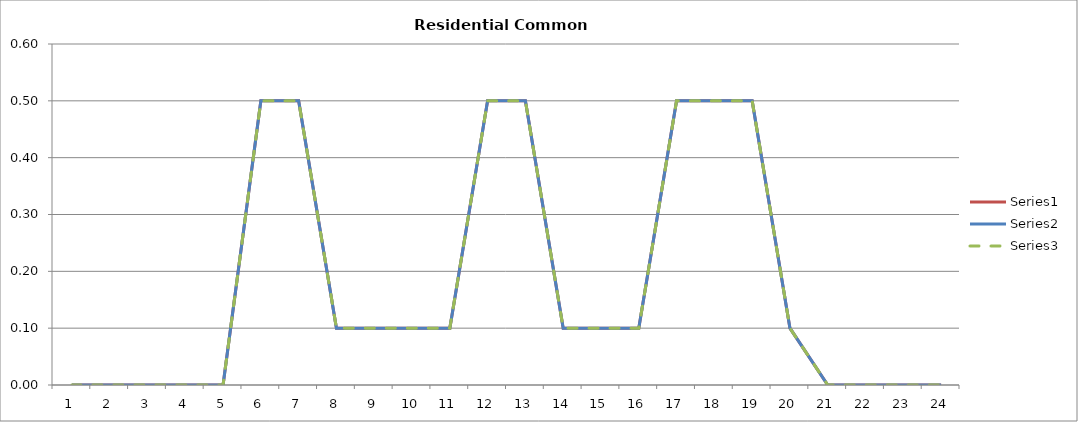
| Category | Series 1 | Series 2 | Series 3 |
|---|---|---|---|
| 0 | 0 | 0 | 0 |
| 1 | 0 | 0 | 0 |
| 2 | 0 | 0 | 0 |
| 3 | 0 | 0 | 0 |
| 4 | 0 | 0 | 0 |
| 5 | 0.5 | 0.5 | 0.5 |
| 6 | 0.5 | 0.5 | 0.5 |
| 7 | 0.1 | 0.1 | 0.1 |
| 8 | 0.1 | 0.1 | 0.1 |
| 9 | 0.1 | 0.1 | 0.1 |
| 10 | 0.1 | 0.1 | 0.1 |
| 11 | 0.5 | 0.5 | 0.5 |
| 12 | 0.5 | 0.5 | 0.5 |
| 13 | 0.1 | 0.1 | 0.1 |
| 14 | 0.1 | 0.1 | 0.1 |
| 15 | 0.1 | 0.1 | 0.1 |
| 16 | 0.5 | 0.5 | 0.5 |
| 17 | 0.5 | 0.5 | 0.5 |
| 18 | 0.5 | 0.5 | 0.5 |
| 19 | 0.1 | 0.1 | 0.1 |
| 20 | 0 | 0 | 0 |
| 21 | 0 | 0 | 0 |
| 22 | 0 | 0 | 0 |
| 23 | 0 | 0 | 0 |